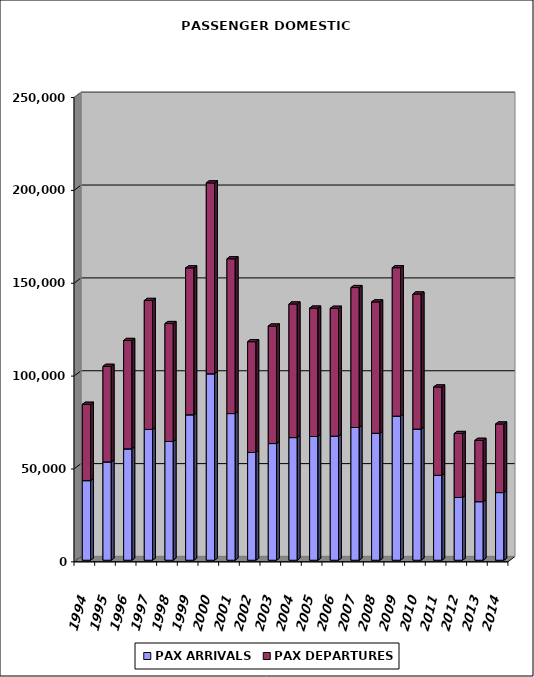
| Category | PAX ARRIVALS | PAX DEPARTURES |
|---|---|---|
| 1994.0 | 42867 | 41085 |
| 1995.0 | 52951 | 51434 |
| 1996.0 | 59966 | 58347 |
| 1997.0 | 70441 | 69414 |
| 1998.0 | 63941 | 63494 |
| 1999.0 | 78306 | 79077 |
| 2000.0 | 100364 | 102786 |
| 2001.0 | 78970 | 83327 |
| 2002.0 | 58025 | 59628 |
| 2003.0 | 62829 | 63261 |
| 2004.0 | 66038 | 71935 |
| 2005.0 | 66623 | 69114 |
| 2006.0 | 66762 | 68893 |
| 2007.0 | 71463 | 75343 |
| 2008.0 | 68354 | 70710 |
| 2009.0 | 77576 | 79914 |
| 2010.0 | 70613 | 72720 |
| 2011.0 | 45742 | 47529 |
| 2012.0 | 33792 | 34440 |
| 2013.0 | 31542 | 33003 |
| 2014.0 | 36423 | 36917 |